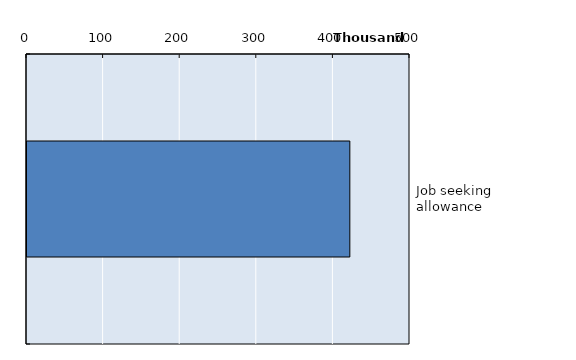
| Category | Series 0 |
|---|---|
| Job seeking allowance | 421457 |